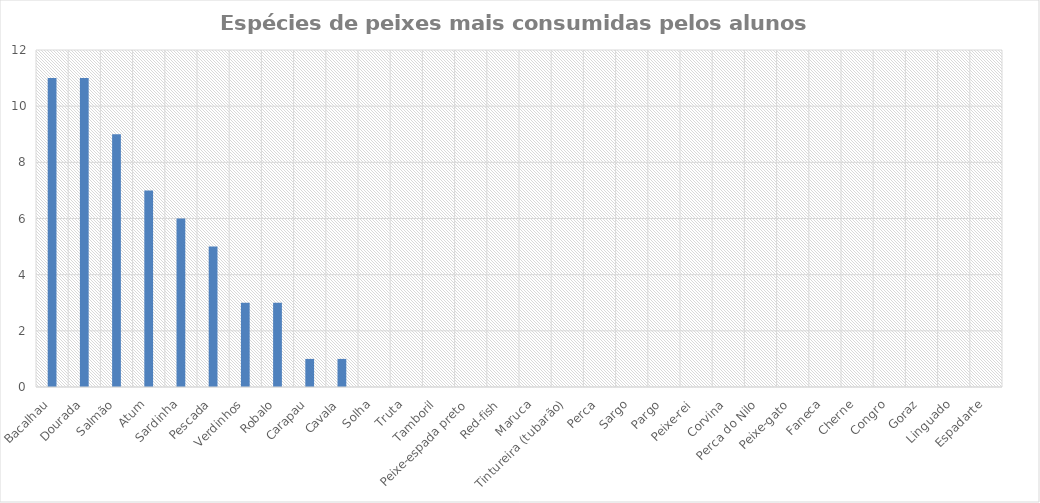
| Category | Series 0 |
|---|---|
| Bacalhau | 11 |
| Dourada | 11 |
| Salmão | 9 |
| Atum | 7 |
| Sardinha | 6 |
| Pescada | 5 |
| Verdinhos | 3 |
| Robalo | 3 |
| Carapau | 1 |
| Cavala | 1 |
| Solha | 0 |
| Truta | 0 |
| Tamboril | 0 |
| Peixe-espada preto | 0 |
| Red-fish | 0 |
| Maruca | 0 |
| Tintureira (tubarão) | 0 |
| Perca | 0 |
| Sargo | 0 |
| Pargo | 0 |
| Peixe-rei | 0 |
| Corvina | 0 |
| Perca do Nilo | 0 |
| Peixe-gato | 0 |
| Faneca | 0 |
| Cherne | 0 |
| Congro | 0 |
| Goraz | 0 |
| Linguado | 0 |
| Espadarte | 0 |